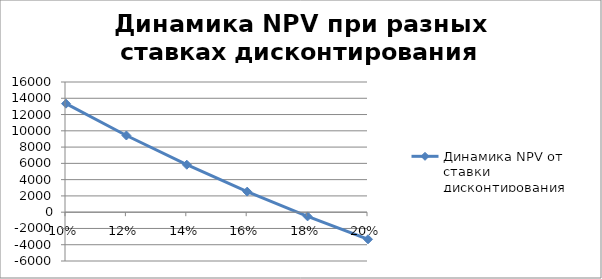
| Category | Динамика NPV от ставки дисконтирования |
|---|---|
| 0.1 | 13337.84 |
| 0.12 | 9425.35 |
| 0.14 | 5833 |
| 0.16 | 2528.32 |
| 0.18 | -517.4 |
| 0.2 | -3329.4 |